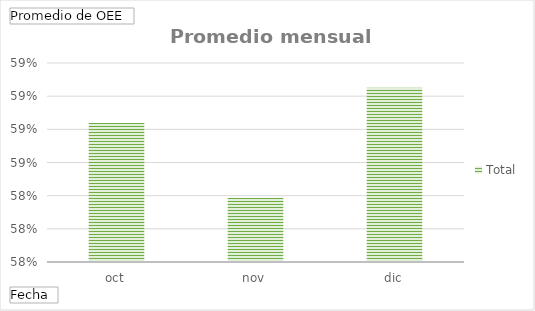
| Category | Total |
|---|---|
| oct | 0.588 |
| nov | 0.584 |
| dic | 0.591 |